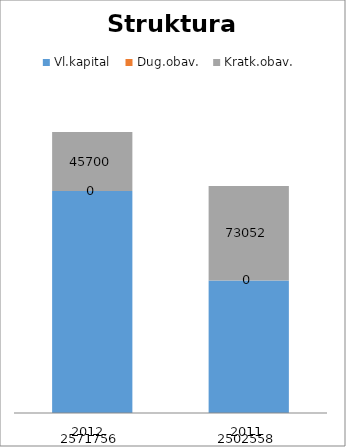
| Category | Vl.kapital | Dug.obav. | Kratk.obav. |
|---|---|---|---|
| 2012. | 2571756 | 0 | 45700 |
| 2011 | 2502558 | 0 | 73052 |